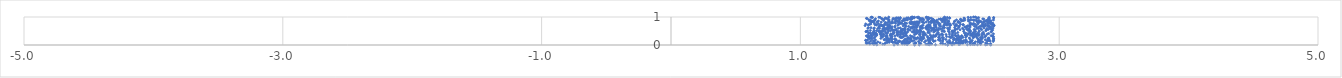
| Category | Series 0 |
|---|---|
| 1.7237332028075518 | 0.001 |
| 1.882748835907967 | 0.002 |
| 2.471586069455662 | 0.003 |
| 2.1382813638817306 | 0.004 |
| 1.918665016883203 | 0.005 |
| 2.171909465776195 | 0.006 |
| 1.5909485053726797 | 0.007 |
| 2.138546518124576 | 0.008 |
| 2.043990925426257 | 0.009 |
| 2.430048507275156 | 0.01 |
| 2.2902537398272735 | 0.011 |
| 2.368165509892724 | 0.012 |
| 1.9988286297892175 | 0.013 |
| 2.225716510607286 | 0.014 |
| 2.4675523579315386 | 0.015 |
| 2.314643511475454 | 0.016 |
| 2.345819721687081 | 0.017 |
| 1.8260875541533066 | 0.018 |
| 2.4404933254403716 | 0.019 |
| 1.5682483276719834 | 0.02 |
| 2.39247810780129 | 0.021 |
| 1.9891321421073 | 0.022 |
| 1.75243366401327 | 0.023 |
| 2.3311775300128255 | 0.024 |
| 1.9866749900236356 | 0.025 |
| 1.9714196126807697 | 0.026 |
| 2.1702953431216407 | 0.027 |
| 2.1198566185879715 | 0.028 |
| 1.6509906069884785 | 0.029 |
| 1.6366722197609636 | 0.03 |
| 1.80601272595931 | 0.031 |
| 2.233850033607773 | 0.032 |
| 2.1876061933160713 | 0.033 |
| 1.8207254967126878 | 0.034 |
| 2.014921914973437 | 0.035 |
| 1.5363239770543773 | 0.036 |
| 2.310866650471994 | 0.037 |
| 1.7882402685553676 | 0.038 |
| 1.5858630063163965 | 0.039 |
| 2.4435031476836073 | 0.04 |
| 2.1010850759437316 | 0.041 |
| 2.340150128498161 | 0.042 |
| 2.009460501919902 | 0.043 |
| 2.335685313521146 | 0.044 |
| 2.4447012469592506 | 0.045 |
| 2.4701983635999056 | 0.046 |
| 2.3451144387383684 | 0.047 |
| 1.5629840887249191 | 0.048 |
| 2.335188267820345 | 0.049 |
| 1.8073569865215653 | 0.05 |
| 1.747438920068186 | 0.051 |
| 1.9299514342420228 | 0.052 |
| 1.6542348469321673 | 0.053 |
| 1.8790285164245604 | 0.054 |
| 1.510015415111478 | 0.055 |
| 2.2257727269368854 | 0.056 |
| 2.3409517435828993 | 0.057 |
| 2.084941480671676 | 0.058 |
| 1.555101655902463 | 0.059 |
| 2.2555045448514073 | 0.06 |
| 2.391488594969658 | 0.061 |
| 2.006279042866012 | 0.062 |
| 1.8078790761721137 | 0.063 |
| 1.891199066479564 | 0.064 |
| 1.8238158062441552 | 0.065 |
| 1.5191131516174985 | 0.066 |
| 1.583671910317975 | 0.067 |
| 1.5739382687393062 | 0.068 |
| 1.750592329933196 | 0.069 |
| 1.9196501560487569 | 0.07 |
| 2.155150580218385 | 0.071 |
| 1.8368053971841434 | 0.072 |
| 2.431769014729178 | 0.073 |
| 1.7828151863638704 | 0.074 |
| 1.8370774628337654 | 0.075 |
| 1.8203060608095025 | 0.076 |
| 1.6155356981259796 | 0.077 |
| 1.7351728884774267 | 0.078 |
| 2.20857140805085 | 0.079 |
| 2.227019202079972 | 0.08 |
| 1.891751562771871 | 0.081 |
| 2.2454488427222716 | 0.082 |
| 2.201081865934156 | 0.083 |
| 2.256224331571744 | 0.084 |
| 2.390179876782452 | 0.085 |
| 1.6613442911637182 | 0.086 |
| 2.2217612881812654 | 0.087 |
| 2.2766104970808136 | 0.088 |
| 2.202188045415264 | 0.089 |
| 2.148575575833101 | 0.09 |
| 1.7152550223699468 | 0.091 |
| 2.2201513464445557 | 0.092 |
| 1.8445886196130337 | 0.093 |
| 1.5310896702430674 | 0.094 |
| 1.674565644683562 | 0.095 |
| 2.243089712973069 | 0.096 |
| 1.6872108831316353 | 0.097 |
| 2.1584276366491064 | 0.098 |
| 2.177592521919505 | 0.099 |
| 1.9928641252547337 | 0.1 |
| 1.8199793759425298 | 0.101 |
| 1.8133065112725313 | 0.102 |
| 1.5086511343072755 | 0.103 |
| 2.3788754048578133 | 0.104 |
| 1.9593883359362332 | 0.105 |
| 2.306728796856522 | 0.106 |
| 2.2548754182531705 | 0.107 |
| 1.73004450707892 | 0.108 |
| 1.6711513733126075 | 0.109 |
| 1.841183708515287 | 0.11 |
| 1.5983815292632264 | 0.111 |
| 2.3525438385473754 | 0.112 |
| 2.3198979786266745 | 0.113 |
| 2.408025097613603 | 0.114 |
| 2.135286087033086 | 0.115 |
| 1.708923711651487 | 0.116 |
| 2.098748644021502 | 0.117 |
| 1.7861183289949256 | 0.118 |
| 1.7966911886464918 | 0.119 |
| 2.2446226774864284 | 0.12 |
| 1.7949766950047423 | 0.121 |
| 2.3905973761056694 | 0.122 |
| 2.287836473247583 | 0.123 |
| 1.7668973885473096 | 0.124 |
| 1.7974677519927815 | 0.125 |
| 2.3711048262698826 | 0.126 |
| 2.3835247092846505 | 0.127 |
| 2.4901511247814074 | 0.128 |
| 1.5706937823165514 | 0.129 |
| 1.9131375157501447 | 0.13 |
| 1.8234408346859827 | 0.131 |
| 2.0302889672843496 | 0.132 |
| 1.7567538886418212 | 0.133 |
| 2.315601939647743 | 0.134 |
| 2.0299294283368656 | 0.135 |
| 1.704957308534385 | 0.136 |
| 2.239977768906573 | 0.137 |
| 1.99975694525939 | 0.138 |
| 1.7663582348950428 | 0.139 |
| 2.277146396891503 | 0.14 |
| 2.4455210959504186 | 0.141 |
| 1.8649370185710383 | 0.142 |
| 2.4661843026425094 | 0.143 |
| 1.543161921993343 | 0.144 |
| 2.320424527574395 | 0.145 |
| 1.6845414057181123 | 0.146 |
| 2.0415492052724673 | 0.147 |
| 1.9906524354615707 | 0.148 |
| 1.9690454856760344 | 0.149 |
| 1.9362656966297571 | 0.15 |
| 1.563045848716329 | 0.151 |
| 2.258890412158045 | 0.152 |
| 2.224968275531674 | 0.153 |
| 2.079840517275368 | 0.154 |
| 2.4622257799955785 | 0.155 |
| 2.2733809679094614 | 0.156 |
| 2.443821767074181 | 0.157 |
| 1.8780582505685506 | 0.158 |
| 2.236160886584215 | 0.159 |
| 1.8278959691286245 | 0.16 |
| 2.3273977170741826 | 0.161 |
| 1.8568674850468545 | 0.162 |
| 2.3825830412679365 | 0.163 |
| 1.5049253353537528 | 0.164 |
| 1.6869780335541056 | 0.165 |
| 1.740047682553591 | 0.166 |
| 2.4523378885008773 | 0.167 |
| 2.1517225158905333 | 0.168 |
| 2.098329833261535 | 0.169 |
| 1.5050116736161605 | 0.17 |
| 2.3886438879064142 | 0.171 |
| 1.6735257770515632 | 0.172 |
| 1.8033772246039224 | 0.173 |
| 2.4922048758694872 | 0.174 |
| 1.6819072800977357 | 0.175 |
| 2.203879635225767 | 0.176 |
| 2.4925899204364486 | 0.177 |
| 1.5190129344182381 | 0.178 |
| 2.2202359185749025 | 0.179 |
| 1.579635950535569 | 0.18 |
| 1.850094884401595 | 0.181 |
| 1.6633113649846476 | 0.182 |
| 2.184464305230267 | 0.183 |
| 2.020468917325707 | 0.184 |
| 2.2317584318441637 | 0.185 |
| 2.0672583160514817 | 0.186 |
| 1.648703574300951 | 0.187 |
| 1.7386492835412435 | 0.188 |
| 2.428672626538442 | 0.189 |
| 2.2787052955061498 | 0.19 |
| 2.0705167990329976 | 0.191 |
| 1.986249264222876 | 0.192 |
| 2.39692164934268 | 0.193 |
| 1.9258375774410053 | 0.194 |
| 1.6483089404588083 | 0.195 |
| 2.0004358962407025 | 0.196 |
| 1.8091481820971111 | 0.197 |
| 2.124653108186333 | 0.198 |
| 2.217248902086676 | 0.199 |
| 2.104429755286774 | 0.2 |
| 2.3747159633148613 | 0.201 |
| 2.375512604834519 | 0.202 |
| 1.728298977042551 | 0.203 |
| 2.2069766111612434 | 0.204 |
| 1.6898122417063013 | 0.205 |
| 2.184038913723883 | 0.206 |
| 1.7086407837023443 | 0.207 |
| 2.21256164684351 | 0.208 |
| 2.2047105018198883 | 0.209 |
| 1.9243534296739089 | 0.21 |
| 2.4580477750377745 | 0.211 |
| 2.186103885475794 | 0.212 |
| 1.8953989668379918 | 0.213 |
| 1.674833545371972 | 0.214 |
| 1.9240389903905935 | 0.215 |
| 1.9244828674496302 | 0.216 |
| 2.3103451705240112 | 0.217 |
| 1.8160371999578198 | 0.218 |
| 1.6767257948298904 | 0.219 |
| 2.395252549273313 | 0.22 |
| 1.5526964066079953 | 0.221 |
| 2.2198624599350243 | 0.222 |
| 1.8554279124472484 | 0.223 |
| 1.7311765673496753 | 0.224 |
| 1.5329940117107745 | 0.225 |
| 1.9441836107186927 | 0.226 |
| 1.8492295396161538 | 0.227 |
| 2.241552397692698 | 0.228 |
| 2.0799300626560773 | 0.229 |
| 1.832767476896265 | 0.23 |
| 1.9459835859240755 | 0.231 |
| 2.4919665316460864 | 0.232 |
| 2.1895359250191038 | 0.233 |
| 2.4496762034102937 | 0.234 |
| 2.493593560203471 | 0.235 |
| 1.6687570864491765 | 0.236 |
| 1.621986740614874 | 0.237 |
| 1.9542151377747599 | 0.238 |
| 1.8796078752504206 | 0.239 |
| 1.5436683642035571 | 0.24 |
| 2.4047088022749548 | 0.241 |
| 1.8490011309872436 | 0.242 |
| 1.8319868549455927 | 0.243 |
| 1.9935783260728024 | 0.244 |
| 1.7033785124590026 | 0.245 |
| 2.0031335389803697 | 0.246 |
| 1.6651975466587565 | 0.247 |
| 2.2132304790881916 | 0.248 |
| 1.5708474971004214 | 0.249 |
| 1.8902337169158316 | 0.25 |
| 2.3059149328522195 | 0.251 |
| 2.4566430941111834 | 0.252 |
| 2.1055564213004594 | 0.253 |
| 1.6715390698922574 | 0.254 |
| 1.9047270015734608 | 0.255 |
| 1.9326884578325831 | 0.256 |
| 2.3358930967044547 | 0.257 |
| 2.0986865605667844 | 0.258 |
| 2.4051977766031944 | 0.259 |
| 1.9078257587631895 | 0.26 |
| 1.6996246698212958 | 0.261 |
| 2.163341146431509 | 0.262 |
| 2.3645481185470603 | 0.263 |
| 1.984165096719237 | 0.264 |
| 2.0237451923309875 | 0.265 |
| 1.784043980209309 | 0.266 |
| 2.0093301783107713 | 0.267 |
| 1.831410537760354 | 0.268 |
| 1.7765083412069964 | 0.269 |
| 2.0678434874578375 | 0.27 |
| 2.3921357893836217 | 0.271 |
| 2.2561550505988586 | 0.272 |
| 1.5318780975749737 | 0.273 |
| 1.8762712514793511 | 0.274 |
| 1.9493964471285055 | 0.275 |
| 2.225991492766874 | 0.276 |
| 2.097629536599496 | 0.277 |
| 1.776599976573712 | 0.278 |
| 1.5206592298381896 | 0.279 |
| 2.1564263453191606 | 0.28 |
| 2.2779824860535136 | 0.281 |
| 2.335817697552415 | 0.282 |
| 2.405684973676826 | 0.283 |
| 2.0179022268346243 | 0.284 |
| 2.176195204743806 | 0.285 |
| 1.7912415795516172 | 0.286 |
| 2.232135855527561 | 0.287 |
| 1.6334346819311554 | 0.288 |
| 2.014988512667553 | 0.289 |
| 1.7673948563051436 | 0.29 |
| 1.5775520605017308 | 0.291 |
| 1.79487852998955 | 0.292 |
| 2.4256175100033337 | 0.293 |
| 1.9287359153991037 | 0.294 |
| 1.5529951919053577 | 0.295 |
| 1.705870606010957 | 0.296 |
| 1.5255106362179705 | 0.297 |
| 2.4917540668055427 | 0.298 |
| 2.1510438559226976 | 0.299 |
| 1.7069180375402717 | 0.3 |
| 2.345125684176023 | 0.301 |
| 2.1300523141511105 | 0.302 |
| 1.8626681797267368 | 0.303 |
| 1.6362113548163464 | 0.304 |
| 1.7746335329876537 | 0.305 |
| 2.359662038290516 | 0.306 |
| 2.0125508785722053 | 0.307 |
| 1.9825573085382424 | 0.308 |
| 1.532286519275866 | 0.309 |
| 2.2451475261283695 | 0.31 |
| 2.483876309280257 | 0.311 |
| 1.6699328025917146 | 0.312 |
| 2.0731981520535876 | 0.313 |
| 2.4872951572797852 | 0.314 |
| 1.658178557650316 | 0.315 |
| 1.6241600466464892 | 0.316 |
| 2.0362776007154646 | 0.317 |
| 2.2063218398664985 | 0.318 |
| 1.8004478081877409 | 0.319 |
| 2.0419222539143984 | 0.32 |
| 2.2026653468174326 | 0.321 |
| 1.9508865438536258 | 0.322 |
| 2.329649861006288 | 0.323 |
| 2.433518285323636 | 0.324 |
| 1.5097324129050964 | 0.325 |
| 2.045870170589543 | 0.326 |
| 1.7309515350644333 | 0.327 |
| 2.286655310450631 | 0.328 |
| 2.0434555675498496 | 0.329 |
| 2.2473574516476873 | 0.33 |
| 1.8496678565980127 | 0.331 |
| 1.7027026638232545 | 0.332 |
| 1.6954513882413935 | 0.333 |
| 2.170719149762374 | 0.334 |
| 2.473983836873047 | 0.335 |
| 1.9498701507093883 | 0.336 |
| 1.810862213509833 | 0.337 |
| 1.8208226363886633 | 0.338 |
| 1.7508567920741993 | 0.339 |
| 1.547015028484602 | 0.34 |
| 2.027414619509892 | 0.341 |
| 1.587692411038472 | 0.342 |
| 2.377538829962236 | 0.343 |
| 2.218964383172928 | 0.344 |
| 1.667561875264752 | 0.345 |
| 2.403276865595239 | 0.346 |
| 2.046847828628187 | 0.347 |
| 2.314798789139113 | 0.348 |
| 2.3612614978428237 | 0.349 |
| 2.1945889943586483 | 0.35 |
| 2.276733619297499 | 0.351 |
| 1.523386489856851 | 0.352 |
| 2.1758014654343474 | 0.353 |
| 2.274306011779473 | 0.354 |
| 1.5468784276933671 | 0.355 |
| 2.004024126788944 | 0.356 |
| 2.3589308794074495 | 0.357 |
| 1.94943557858479 | 0.358 |
| 1.9227851408391183 | 0.359 |
| 1.6218830155103392 | 0.36 |
| 1.5907881824590222 | 0.361 |
| 1.8818259851312424 | 0.362 |
| 1.562504928801201 | 0.363 |
| 1.6244540948060557 | 0.364 |
| 1.69551688290381 | 0.365 |
| 1.9685904576670414 | 0.366 |
| 2.1001768841870856 | 0.367 |
| 2.077294417204895 | 0.368 |
| 1.6449191848700657 | 0.369 |
| 2.322795292487451 | 0.37 |
| 1.9472205429175622 | 0.371 |
| 1.7743761540773904 | 0.372 |
| 2.125779881198005 | 0.373 |
| 2.3815385712475576 | 0.374 |
| 2.0936996747401793 | 0.375 |
| 1.573204431804577 | 0.376 |
| 1.7499946152882844 | 0.377 |
| 2.3399735538756556 | 0.378 |
| 1.7703291400801424 | 0.379 |
| 1.7034255626101376 | 0.38 |
| 1.918484786524306 | 0.381 |
| 2.4191308569159986 | 0.382 |
| 1.7508391153396856 | 0.383 |
| 2.317306765400807 | 0.384 |
| 2.3554151947657136 | 0.385 |
| 2.344378410772738 | 0.386 |
| 1.7922997557099691 | 0.387 |
| 2.2955555969549266 | 0.388 |
| 1.640785191327218 | 0.389 |
| 1.6982711349570696 | 0.39 |
| 2.152368634688698 | 0.391 |
| 2.444453266263234 | 0.392 |
| 2.0611860546655336 | 0.393 |
| 1.5867557178241891 | 0.394 |
| 2.0927624287940745 | 0.395 |
| 1.7161159949324993 | 0.396 |
| 2.491662989628783 | 0.397 |
| 2.366724665747304 | 0.398 |
| 1.617122124465577 | 0.399 |
| 1.8148711279750334 | 0.4 |
| 1.925876073298782 | 0.401 |
| 2.1753517964194797 | 0.402 |
| 1.9629046380513597 | 0.403 |
| 1.8933163336285284 | 0.404 |
| 1.9581028076748774 | 0.405 |
| 1.7938709545772467 | 0.406 |
| 2.2965827763312414 | 0.407 |
| 2.055491239833895 | 0.408 |
| 2.455831051641306 | 0.409 |
| 1.800630885886442 | 0.41 |
| 2.403964755224097 | 0.411 |
| 1.5857024121605536 | 0.412 |
| 1.9547671141250826 | 0.413 |
| 2.3314955744959005 | 0.414 |
| 2.335904941962931 | 0.415 |
| 1.5429525220004172 | 0.416 |
| 2.198261302415105 | 0.417 |
| 1.5768612681618919 | 0.418 |
| 1.5736819883393725 | 0.419 |
| 2.3718044699826004 | 0.42 |
| 1.577049348863933 | 0.421 |
| 2.2783365515499012 | 0.422 |
| 1.660589403214285 | 0.423 |
| 1.6722559283097413 | 0.424 |
| 2.2682652143997846 | 0.425 |
| 1.526057169457134 | 0.426 |
| 1.5338239035805827 | 0.427 |
| 1.8183124250690692 | 0.428 |
| 1.7222767633380949 | 0.429 |
| 1.8999880689729824 | 0.43 |
| 2.3120210861961654 | 0.431 |
| 2.3347660942188697 | 0.432 |
| 1.7761685993441998 | 0.433 |
| 1.955051247220415 | 0.434 |
| 1.9965179397071395 | 0.435 |
| 1.560192315664367 | 0.436 |
| 1.898756185312188 | 0.437 |
| 1.7774097284665293 | 0.438 |
| 1.9257914881678073 | 0.439 |
| 1.6191744975186355 | 0.44 |
| 1.7454577964995286 | 0.441 |
| 1.8877774319536664 | 0.442 |
| 1.719420734402269 | 0.443 |
| 2.064980040298484 | 0.444 |
| 1.6295808296820895 | 0.445 |
| 2.2165628728014344 | 0.446 |
| 1.986057256330896 | 0.447 |
| 1.561973694179311 | 0.448 |
| 1.902709640247564 | 0.449 |
| 1.5721307142158203 | 0.45 |
| 1.7536982003167072 | 0.451 |
| 1.9480797417001439 | 0.452 |
| 1.75480157850069 | 0.453 |
| 1.8104022005711593 | 0.454 |
| 1.8919232741782697 | 0.455 |
| 2.34069924314718 | 0.456 |
| 2.41426868659843 | 0.457 |
| 1.8773607778629884 | 0.458 |
| 1.7717100863457667 | 0.459 |
| 2.151210857395381 | 0.46 |
| 2.1758567841022343 | 0.461 |
| 1.8738720137448066 | 0.462 |
| 2.0304357816781677 | 0.463 |
| 1.8793355450767575 | 0.464 |
| 1.9511500254676162 | 0.465 |
| 1.7829995156736858 | 0.466 |
| 1.8047472530320952 | 0.467 |
| 1.8287430251921055 | 0.468 |
| 2.4765421068506823 | 0.469 |
| 1.8646695632188937 | 0.47 |
| 2.184644992842214 | 0.471 |
| 1.7554675281496062 | 0.472 |
| 1.6557474117350552 | 0.473 |
| 1.5071981113707498 | 0.474 |
| 2.3539897722631884 | 0.475 |
| 1.6785961498032553 | 0.476 |
| 2.1130022009481335 | 0.477 |
| 1.7804322815691715 | 0.478 |
| 1.9891641333181296 | 0.479 |
| 2.308013766891177 | 0.48 |
| 2.4743831558859264 | 0.481 |
| 2.381448763565972 | 0.482 |
| 1.9124630770985989 | 0.483 |
| 1.6065762085604398 | 0.484 |
| 2.314406388435472 | 0.485 |
| 2.26181849731854 | 0.486 |
| 1.5091596089408106 | 0.487 |
| 2.173481609666861 | 0.488 |
| 1.6193046143517869 | 0.489 |
| 1.7510051830174798 | 0.49 |
| 2.1838046659524672 | 0.491 |
| 1.9318858544767243 | 0.492 |
| 1.6063882403017302 | 0.493 |
| 2.1020112740658305 | 0.494 |
| 2.143427583857674 | 0.495 |
| 2.0946663940255092 | 0.496 |
| 2.0394485598740246 | 0.497 |
| 1.6390323031533445 | 0.498 |
| 2.381769732326766 | 0.499 |
| 1.5185248409090457 | 0.5 |
| 1.9195240137001637 | 0.501 |
| 2.172493435938589 | 0.502 |
| 1.7763961831275688 | 0.503 |
| 1.877391955610109 | 0.504 |
| 1.92862262043248 | 0.505 |
| 2.011435893787809 | 0.506 |
| 1.5687092870673842 | 0.507 |
| 1.8091704816520835 | 0.508 |
| 1.6966185386910113 | 0.509 |
| 1.5884910781864345 | 0.51 |
| 2.4332107804784484 | 0.511 |
| 1.918078790081295 | 0.512 |
| 2.1081313714194323 | 0.513 |
| 2.193488883848744 | 0.514 |
| 2.3124744671712882 | 0.515 |
| 1.7140327995636166 | 0.516 |
| 1.6328385848737794 | 0.517 |
| 2.0566861542433115 | 0.518 |
| 1.5406178876549128 | 0.519 |
| 1.8962097638183306 | 0.52 |
| 1.777199203979184 | 0.521 |
| 1.7869382286465454 | 0.522 |
| 1.7244673563353141 | 0.523 |
| 1.7244702886765846 | 0.524 |
| 2.0356323205381606 | 0.525 |
| 2.2946005217123093 | 0.526 |
| 2.042146582453109 | 0.527 |
| 1.7384851571321627 | 0.528 |
| 1.847650302661895 | 0.529 |
| 1.926763065368601 | 0.53 |
| 2.48500330777619 | 0.531 |
| 1.8993887639596883 | 0.532 |
| 2.3471169665276506 | 0.533 |
| 2.066113263058473 | 0.534 |
| 1.6812016048739038 | 0.535 |
| 1.802643106466641 | 0.536 |
| 2.0594433669823062 | 0.537 |
| 2.350928389251408 | 0.538 |
| 2.0443171070695287 | 0.539 |
| 2.4370720044137033 | 0.54 |
| 2.301481554785889 | 0.541 |
| 1.9940726604468764 | 0.542 |
| 1.8798020626320109 | 0.543 |
| 2.019465882415628 | 0.544 |
| 2.4004395940603427 | 0.545 |
| 2.2339288642513964 | 0.546 |
| 2.2630217944083526 | 0.547 |
| 1.6520439503043929 | 0.548 |
| 1.8328946948380151 | 0.549 |
| 1.8076361362557103 | 0.55 |
| 2.0545139728155872 | 0.551 |
| 1.7116666716818842 | 0.552 |
| 2.1954137634412643 | 0.553 |
| 2.342716499584012 | 0.554 |
| 2.4508295159942834 | 0.555 |
| 1.9803032206175464 | 0.556 |
| 1.6727433212825933 | 0.557 |
| 1.7399225616985439 | 0.558 |
| 2.197547346939071 | 0.559 |
| 1.7842419728305654 | 0.56 |
| 1.8340693434998383 | 0.561 |
| 2.148497428182045 | 0.562 |
| 1.7919443391769403 | 0.563 |
| 2.3047417406566706 | 0.564 |
| 1.663049221421684 | 0.565 |
| 1.9259429770837473 | 0.566 |
| 2.285245378149639 | 0.567 |
| 1.8312036976011807 | 0.568 |
| 2.478526051175084 | 0.569 |
| 1.9776690477830714 | 0.57 |
| 2.0268368470926497 | 0.571 |
| 2.151724874881758 | 0.572 |
| 2.081851414864756 | 0.573 |
| 2.2124954302161406 | 0.574 |
| 2.1428992339748674 | 0.575 |
| 1.6526598904370753 | 0.576 |
| 2.094899500759572 | 0.577 |
| 2.465864061059491 | 0.578 |
| 1.6370941060048487 | 0.579 |
| 1.650978508772817 | 0.58 |
| 1.6656863726581284 | 0.581 |
| 1.5673602900960177 | 0.582 |
| 2.3023237604820137 | 0.583 |
| 1.5973313993013905 | 0.584 |
| 2.393424820223006 | 0.585 |
| 1.8049860898772527 | 0.586 |
| 2.02750617881522 | 0.587 |
| 2.4413278139630954 | 0.588 |
| 1.8070100941987421 | 0.589 |
| 2.3770796179922544 | 0.59 |
| 1.7017711547415297 | 0.591 |
| 1.6108303588631676 | 0.592 |
| 2.3648348109761788 | 0.593 |
| 1.8638117195850876 | 0.594 |
| 2.0701154869571643 | 0.595 |
| 1.7556103226775894 | 0.596 |
| 1.522014606584091 | 0.597 |
| 1.6861858569179873 | 0.598 |
| 2.0094306664101818 | 0.599 |
| 2.2534191124223506 | 0.6 |
| 2.0305582932505977 | 0.601 |
| 1.6801117456548793 | 0.602 |
| 2.137019724672337 | 0.603 |
| 1.943419032065382 | 0.604 |
| 2.488652878448404 | 0.605 |
| 2.419007178022867 | 0.606 |
| 1.9679902240480283 | 0.607 |
| 1.6502945079384248 | 0.608 |
| 1.5711225696419968 | 0.609 |
| 1.9417130724707228 | 0.61 |
| 1.7710255402160886 | 0.611 |
| 1.8927244945176418 | 0.612 |
| 2.0293083374224037 | 0.613 |
| 1.855488022815928 | 0.614 |
| 2.111886924792306 | 0.615 |
| 1.9393982943653014 | 0.616 |
| 1.9912527088002812 | 0.617 |
| 1.8510213554524144 | 0.618 |
| 1.5456875046393668 | 0.619 |
| 2.1927191140915587 | 0.62 |
| 1.5252554364481252 | 0.621 |
| 1.673232227621289 | 0.622 |
| 2.1114339398829385 | 0.623 |
| 2.279624251085424 | 0.624 |
| 2.224047303636441 | 0.625 |
| 1.6084529418570817 | 0.626 |
| 1.8799061753106283 | 0.627 |
| 1.7009639671147916 | 0.628 |
| 1.9704012446053203 | 0.629 |
| 2.0502252253633686 | 0.63 |
| 1.9349477385321139 | 0.631 |
| 2.007137226107053 | 0.632 |
| 1.900591086230056 | 0.633 |
| 2.1012189033564503 | 0.634 |
| 2.1535008487081146 | 0.635 |
| 1.7303944040359696 | 0.636 |
| 1.871383493112174 | 0.637 |
| 1.6915489793652907 | 0.638 |
| 2.360578955349529 | 0.639 |
| 1.928685257844968 | 0.64 |
| 2.4616344093961477 | 0.641 |
| 1.685740530120356 | 0.642 |
| 2.4727498203536253 | 0.643 |
| 2.311906319729641 | 0.644 |
| 2.3795438674667118 | 0.645 |
| 1.8768551186802043 | 0.646 |
| 1.9953575630470484 | 0.647 |
| 1.678618859174862 | 0.648 |
| 1.9250104415370983 | 0.649 |
| 2.2901900625587848 | 0.65 |
| 1.7087397150517531 | 0.651 |
| 1.6433382992564636 | 0.652 |
| 2.2708490670132697 | 0.653 |
| 1.9847544228039555 | 0.654 |
| 2.413979185586623 | 0.655 |
| 1.8656640568857719 | 0.656 |
| 2.0428877256191575 | 0.657 |
| 1.6078546448425053 | 0.658 |
| 1.9775299130423383 | 0.659 |
| 1.9379732262483746 | 0.66 |
| 1.815058354143888 | 0.661 |
| 2.284206875412882 | 0.662 |
| 2.2256757783899355 | 0.663 |
| 2.459459146289678 | 0.664 |
| 2.454000776876306 | 0.665 |
| 1.8360808604550931 | 0.666 |
| 2.346024290456766 | 0.667 |
| 1.7309435248763414 | 0.668 |
| 2.0841010190976172 | 0.669 |
| 2.226589294112633 | 0.67 |
| 1.6775464568069194 | 0.671 |
| 2.399727922907941 | 0.672 |
| 2.391098878419743 | 0.673 |
| 1.990164371644668 | 0.674 |
| 1.6114419649714862 | 0.675 |
| 2.4919577414077847 | 0.676 |
| 1.8940481407312688 | 0.677 |
| 2.4475530415420765 | 0.678 |
| 2.4273537463372916 | 0.679 |
| 1.936352866040137 | 0.68 |
| 2.3085619898214436 | 0.681 |
| 1.6903014419138238 | 0.682 |
| 1.6333284809698219 | 0.683 |
| 1.7941612991024298 | 0.684 |
| 1.9777307682734664 | 0.685 |
| 2.075190886269389 | 0.686 |
| 1.811157993691821 | 0.687 |
| 2.1941865956976416 | 0.688 |
| 2.45013763248022 | 0.689 |
| 2.2949414215831365 | 0.69 |
| 1.8982361621081534 | 0.691 |
| 1.9034504252493871 | 0.692 |
| 1.6295889397558385 | 0.693 |
| 1.5001754316568423 | 0.694 |
| 2.001525844749677 | 0.695 |
| 1.6910464347039722 | 0.696 |
| 2.497408850864773 | 0.697 |
| 2.2089465624009184 | 0.698 |
| 2.2016382597675754 | 0.699 |
| 2.045143286691278 | 0.7 |
| 2.411138173743777 | 0.701 |
| 2.107535600524937 | 0.702 |
| 2.4876321039870017 | 0.703 |
| 2.432562779500397 | 0.704 |
| 1.7529887734327336 | 0.705 |
| 2.4190368003977727 | 0.706 |
| 1.9477818527771689 | 0.707 |
| 2.3602101020000084 | 0.708 |
| 2.161016493176991 | 0.709 |
| 1.6263460909546845 | 0.71 |
| 1.909090216222936 | 0.711 |
| 2.114167537879468 | 0.712 |
| 2.0346438641256634 | 0.713 |
| 2.1309105397544084 | 0.714 |
| 1.6708429193516958 | 0.715 |
| 2.4928151141616492 | 0.716 |
| 1.5849497463453708 | 0.717 |
| 1.5225728434076635 | 0.718 |
| 1.6467908322648 | 0.719 |
| 1.909517940545069 | 0.72 |
| 2.151783140415148 | 0.721 |
| 1.5895055262807245 | 0.722 |
| 1.999723362264843 | 0.723 |
| 1.6190730487009442 | 0.724 |
| 2.258461769591599 | 0.725 |
| 2.312828386896612 | 0.726 |
| 2.256807812275295 | 0.727 |
| 2.482777880721149 | 0.728 |
| 1.9888443318534743 | 0.729 |
| 1.6536157835240466 | 0.73 |
| 1.5752075014270515 | 0.731 |
| 2.3341538738043717 | 0.732 |
| 1.533090481444018 | 0.733 |
| 2.2027038487344064 | 0.734 |
| 1.8747447075240191 | 0.735 |
| 2.236590122848873 | 0.736 |
| 2.0468097734809154 | 0.737 |
| 2.4727598536060573 | 0.738 |
| 1.8850177417889507 | 0.739 |
| 1.7605328079684686 | 0.74 |
| 1.8792775969705586 | 0.741 |
| 2.143392845555986 | 0.742 |
| 1.6853185183842165 | 0.743 |
| 2.4054736054476034 | 0.744 |
| 2.1345373591410852 | 0.745 |
| 1.8032514472764873 | 0.746 |
| 1.5436558979336459 | 0.747 |
| 2.068830765984048 | 0.748 |
| 2.080205646463148 | 0.749 |
| 2.321905475395403 | 0.75 |
| 1.6552858987659391 | 0.751 |
| 1.5047920421602403 | 0.752 |
| 2.3467854519531404 | 0.753 |
| 2.4480349079723247 | 0.754 |
| 1.6533235277230598 | 0.755 |
| 2.1560322507810334 | 0.756 |
| 2.4296363390314926 | 0.757 |
| 1.80439426852507 | 0.758 |
| 2.1381454517792386 | 0.759 |
| 2.372471375301687 | 0.76 |
| 2.1157333162660708 | 0.761 |
| 1.8563781928500696 | 0.762 |
| 1.6025706123667802 | 0.763 |
| 1.8877242803854795 | 0.764 |
| 2.182724998297578 | 0.765 |
| 2.4810985147837448 | 0.766 |
| 2.336226803516419 | 0.767 |
| 1.7865191360462465 | 0.768 |
| 1.848793750784553 | 0.769 |
| 1.7602328111361496 | 0.77 |
| 1.7358439458263308 | 0.771 |
| 1.9038927919492061 | 0.772 |
| 1.8203574402718665 | 0.773 |
| 2.314380405356787 | 0.774 |
| 2.4869923488469654 | 0.775 |
| 2.311364482644012 | 0.776 |
| 1.7771212832685548 | 0.777 |
| 1.8629121414898586 | 0.778 |
| 2.068963015931336 | 0.779 |
| 2.458771959566012 | 0.78 |
| 1.775233949520577 | 0.781 |
| 1.706496368229939 | 0.782 |
| 1.571294892291589 | 0.783 |
| 2.464958897316511 | 0.784 |
| 2.032694946587318 | 0.785 |
| 2.1177870146421287 | 0.786 |
| 1.8604171507453249 | 0.787 |
| 2.411338807316765 | 0.788 |
| 1.6999921186223035 | 0.789 |
| 1.8119247935914315 | 0.79 |
| 1.9554169753369606 | 0.791 |
| 1.6699045078916899 | 0.792 |
| 2.0109308308669482 | 0.793 |
| 1.9185206328439168 | 0.794 |
| 1.7144174711045803 | 0.795 |
| 1.876554968029672 | 0.796 |
| 2.472034009129832 | 0.797 |
| 2.449586289498515 | 0.798 |
| 2.233475816781655 | 0.799 |
| 2.3738661542096295 | 0.8 |
| 1.7658687995990516 | 0.801 |
| 1.9058216701027533 | 0.802 |
| 2.377261845216391 | 0.803 |
| 1.845690966062111 | 0.804 |
| 1.6568589031038614 | 0.805 |
| 2.2191892764615937 | 0.806 |
| 2.062832153102629 | 0.807 |
| 2.4497767522879084 | 0.808 |
| 2.370326093248916 | 0.809 |
| 2.1135309664056665 | 0.81 |
| 1.7312550876832065 | 0.811 |
| 1.5499520975854524 | 0.812 |
| 1.8621403966204673 | 0.813 |
| 2.135250781215092 | 0.814 |
| 1.9437405137892063 | 0.815 |
| 1.8571084230315336 | 0.816 |
| 1.6248138975827664 | 0.817 |
| 1.8808293592981842 | 0.818 |
| 2.2194225773119727 | 0.819 |
| 1.9926075431614447 | 0.82 |
| 1.5915338101752168 | 0.821 |
| 2.051732925675781 | 0.822 |
| 1.9717531030094981 | 0.823 |
| 2.3783795491662896 | 0.824 |
| 2.144233573348154 | 0.825 |
| 1.9034857632941493 | 0.826 |
| 1.8942136795140603 | 0.827 |
| 2.038462331884574 | 0.828 |
| 1.9443402755675248 | 0.829 |
| 2.023541114245425 | 0.83 |
| 2.3968579421502456 | 0.831 |
| 2.095606920921998 | 0.832 |
| 1.6852908872460026 | 0.833 |
| 2.419391061149269 | 0.834 |
| 1.7513642624587895 | 0.835 |
| 2.4192057849971604 | 0.836 |
| 2.190935423857739 | 0.837 |
| 2.00708617268545 | 0.838 |
| 2.2227634847410993 | 0.839 |
| 1.5605244826438867 | 0.84 |
| 1.7087692939421888 | 0.841 |
| 2.1433747324719934 | 0.842 |
| 1.5396892314911894 | 0.843 |
| 2.4575467629652588 | 0.844 |
| 1.9196582372820312 | 0.845 |
| 2.3891879995011824 | 0.846 |
| 1.6839459008954427 | 0.847 |
| 1.5636411793286604 | 0.848 |
| 2.4402487606051197 | 0.849 |
| 2.1920895865484233 | 0.85 |
| 2.0203318879607295 | 0.851 |
| 2.3629127019020073 | 0.852 |
| 2.1453950385412925 | 0.853 |
| 1.7646826587397735 | 0.854 |
| 2.2985838551955995 | 0.855 |
| 1.7465944712496684 | 0.856 |
| 1.5351957067142332 | 0.857 |
| 1.6026968361149425 | 0.858 |
| 2.119305250428447 | 0.859 |
| 2.473081671762364 | 0.86 |
| 1.5504859609530977 | 0.861 |
| 2.112215305202248 | 0.862 |
| 2.4636580895704614 | 0.863 |
| 2.433040206265807 | 0.864 |
| 1.7922066645103314 | 0.865 |
| 2.0250910107046645 | 0.866 |
| 1.7869871233753034 | 0.867 |
| 1.7372866555255344 | 0.868 |
| 2.2490383357591304 | 0.869 |
| 1.6425023882327592 | 0.87 |
| 1.682529969248614 | 0.871 |
| 2.0314763717960664 | 0.872 |
| 1.569934546940253 | 0.873 |
| 2.2452685078979164 | 0.874 |
| 2.0153433028093883 | 0.875 |
| 2.259070945119645 | 0.876 |
| 2.0349485761007906 | 0.877 |
| 2.339499001777825 | 0.878 |
| 2.309054933353912 | 0.879 |
| 2.0978332277182306 | 0.88 |
| 1.7381680813646319 | 0.881 |
| 2.033033849329345 | 0.882 |
| 2.358170296621279 | 0.883 |
| 2.0537531723945643 | 0.884 |
| 1.5752491543496632 | 0.885 |
| 2.2702919033916515 | 0.886 |
| 1.8046606090262887 | 0.887 |
| 2.3771471422230457 | 0.888 |
| 1.804506824393349 | 0.889 |
| 1.5374476642971318 | 0.89 |
| 1.9842409253506963 | 0.891 |
| 2.4451797637559625 | 0.892 |
| 2.343470474560052 | 0.893 |
| 1.685768028638238 | 0.894 |
| 2.4917597037918933 | 0.895 |
| 2.4486904597360843 | 0.896 |
| 2.206425713358171 | 0.897 |
| 2.3113093316008335 | 0.898 |
| 1.8274318554779707 | 0.899 |
| 1.5288794680086462 | 0.9 |
| 2.325364475675423 | 0.901 |
| 1.9533171646565142 | 0.902 |
| 2.1032879352529927 | 0.903 |
| 1.8234813269914831 | 0.904 |
| 2.1313229896119488 | 0.905 |
| 2.092585912923248 | 0.906 |
| 1.9308834191676352 | 0.907 |
| 1.8546560857009395 | 0.908 |
| 1.9868826150533367 | 0.909 |
| 1.7635468289742542 | 0.91 |
| 1.9877086493043574 | 0.911 |
| 2.2380561453583177 | 0.912 |
| 2.297429842340658 | 0.913 |
| 2.0837512801187197 | 0.914 |
| 1.935964372854356 | 0.915 |
| 2.0249104402654328 | 0.916 |
| 1.7144179491132663 | 0.917 |
| 2.105166431931727 | 0.918 |
| 2.2381025310416405 | 0.919 |
| 1.6480747855870974 | 0.92 |
| 1.924353587232713 | 0.921 |
| 2.1141447543347756 | 0.922 |
| 2.0697451792523043 | 0.923 |
| 1.846863716074017 | 0.924 |
| 1.8093564833478943 | 0.925 |
| 2.4591517069543474 | 0.926 |
| 2.4174684905094406 | 0.927 |
| 2.020688121368777 | 0.928 |
| 1.947767499373929 | 0.929 |
| 1.678016063164752 | 0.93 |
| 2.0837348320393314 | 0.931 |
| 2.409486645427614 | 0.932 |
| 1.728342612343331 | 0.933 |
| 1.6321856041780527 | 0.934 |
| 2.4594247944275054 | 0.935 |
| 1.5805763648487745 | 0.936 |
| 2.1039688950684607 | 0.937 |
| 1.8004090038556162 | 0.938 |
| 1.8645014808657603 | 0.939 |
| 1.9343295892450891 | 0.94 |
| 1.9453469155991336 | 0.941 |
| 1.6272357063946032 | 0.942 |
| 1.766757696689702 | 0.943 |
| 1.8484447765566612 | 0.944 |
| 1.5155373604876705 | 0.945 |
| 1.6675003748004 | 0.946 |
| 2.2685715276870773 | 0.947 |
| 1.716960272968242 | 0.948 |
| 2.117985492113576 | 0.949 |
| 1.9976938733336507 | 0.95 |
| 2.114339183658781 | 0.951 |
| 1.5104562141134583 | 0.952 |
| 1.9238895591308918 | 0.953 |
| 2.3650746133878124 | 0.954 |
| 1.7437852555002218 | 0.955 |
| 1.7499338565256648 | 0.956 |
| 2.1538433604928886 | 0.957 |
| 2.0097505817544765 | 0.958 |
| 2.455106970236926 | 0.959 |
| 1.8585839160886215 | 0.96 |
| 2.2639869007945443 | 0.961 |
| 1.772038260893792 | 0.962 |
| 1.821148761331023 | 0.963 |
| 1.9099255979220384 | 0.964 |
| 2.493333712065297 | 0.965 |
| 2.1075833059509046 | 0.966 |
| 1.6559504494632655 | 0.967 |
| 1.740109228257422 | 0.968 |
| 1.7582782296486714 | 0.969 |
| 1.879368595867724 | 0.97 |
| 1.8327671960745033 | 0.971 |
| 2.152205417032506 | 0.972 |
| 1.7716132537684657 | 0.973 |
| 1.9913886106477412 | 0.974 |
| 2.363294668272958 | 0.975 |
| 2.3773914057093823 | 0.976 |
| 1.97271879957637 | 0.977 |
| 1.8571573507734982 | 0.978 |
| 1.9843804342226048 | 0.979 |
| 2.493531949772125 | 0.98 |
| 1.5572378354786924 | 0.981 |
| 2.1350290312241356 | 0.982 |
| 1.8699183114727531 | 0.983 |
| 2.3163113858904794 | 0.984 |
| 2.4593968517022624 | 0.985 |
| 1.5456812288976298 | 0.986 |
| 2.2963574312966957 | 0.987 |
| 1.6148180693544174 | 0.988 |
| 1.8822991000498543 | 0.989 |
| 1.9024708485064927 | 0.99 |
| 1.6066807498524298 | 0.991 |
| 1.8574157758750374 | 0.992 |
| 1.9140340906365099 | 0.993 |
| 1.9732539941270997 | 0.994 |
| 1.682709646835387 | 0.995 |
| 2.1146646376883607 | 0.996 |
| 1.5518646066077473 | 0.997 |
| 1.866122201236296 | 0.998 |
| 2.3514970363362497 | 0.999 |
| 2.3376815926892007 | 1 |